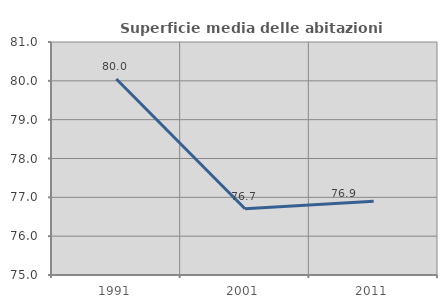
| Category | Superficie media delle abitazioni occupate |
|---|---|
| 1991.0 | 80.047 |
| 2001.0 | 76.707 |
| 2011.0 | 76.898 |